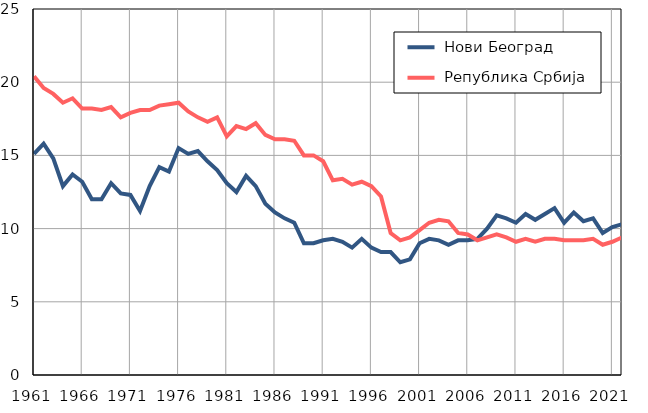
| Category |  Нови Београд |  Република Србија |
|---|---|---|
| 1961.0 | 15.1 | 20.4 |
| 1962.0 | 15.8 | 19.6 |
| 1963.0 | 14.8 | 19.2 |
| 1964.0 | 12.9 | 18.6 |
| 1965.0 | 13.7 | 18.9 |
| 1966.0 | 13.2 | 18.2 |
| 1967.0 | 12 | 18.2 |
| 1968.0 | 12 | 18.1 |
| 1969.0 | 13.1 | 18.3 |
| 1970.0 | 12.4 | 17.6 |
| 1971.0 | 12.3 | 17.9 |
| 1972.0 | 11.2 | 18.1 |
| 1973.0 | 12.9 | 18.1 |
| 1974.0 | 14.2 | 18.4 |
| 1975.0 | 13.9 | 18.5 |
| 1976.0 | 15.5 | 18.6 |
| 1977.0 | 15.1 | 18 |
| 1978.0 | 15.3 | 17.6 |
| 1979.0 | 14.6 | 17.3 |
| 1980.0 | 14 | 17.6 |
| 1981.0 | 13.1 | 16.3 |
| 1982.0 | 12.5 | 17 |
| 1983.0 | 13.6 | 16.8 |
| 1984.0 | 12.9 | 17.2 |
| 1985.0 | 11.7 | 16.4 |
| 1986.0 | 11.1 | 16.1 |
| 1987.0 | 10.7 | 16.1 |
| 1988.0 | 10.4 | 16 |
| 1989.0 | 9 | 15 |
| 1990.0 | 9 | 15 |
| 1991.0 | 9.2 | 14.6 |
| 1992.0 | 9.3 | 13.3 |
| 1993.0 | 9.1 | 13.4 |
| 1994.0 | 8.7 | 13 |
| 1995.0 | 9.3 | 13.2 |
| 1996.0 | 8.7 | 12.9 |
| 1997.0 | 8.4 | 12.2 |
| 1998.0 | 8.4 | 9.7 |
| 1999.0 | 7.7 | 9.2 |
| 2000.0 | 7.9 | 9.4 |
| 2001.0 | 9 | 9.9 |
| 2002.0 | 9.3 | 10.4 |
| 2003.0 | 9.2 | 10.6 |
| 2004.0 | 8.9 | 10.5 |
| 2005.0 | 9.2 | 9.7 |
| 2006.0 | 9.2 | 9.6 |
| 2007.0 | 9.3 | 9.2 |
| 2008.0 | 10 | 9.4 |
| 2009.0 | 10.9 | 9.6 |
| 2010.0 | 10.7 | 9.4 |
| 2011.0 | 10.4 | 9.1 |
| 2012.0 | 11 | 9.3 |
| 2013.0 | 10.6 | 9.1 |
| 2014.0 | 11 | 9.3 |
| 2015.0 | 11.4 | 9.3 |
| 2016.0 | 10.4 | 9.2 |
| 2017.0 | 11.1 | 9.2 |
| 2018.0 | 10.5 | 9.2 |
| 2019.0 | 10.7 | 9.3 |
| 2020.0 | 9.7 | 8.9 |
| 2021.0 | 10.1 | 9.1 |
| 2022.0 | 10.3 | 9.4 |